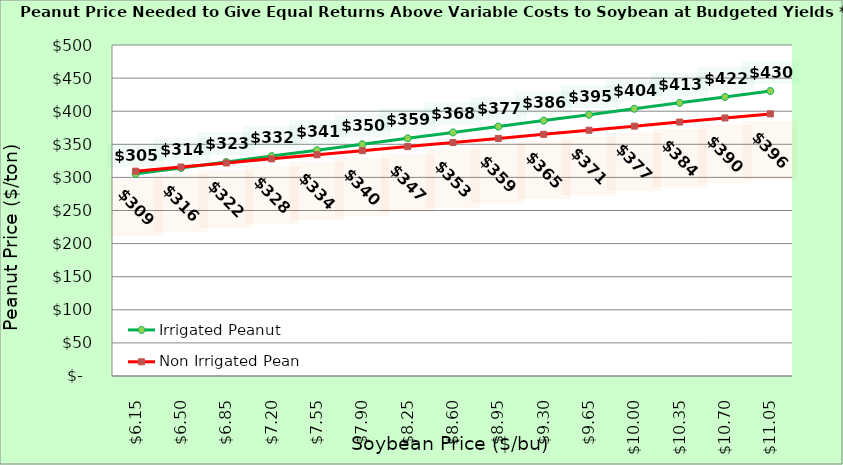
| Category | Irrigated Peanut | Non Irrigated Peanut |
|---|---|---|
| 6.150000000000002 | 305.365 | 309.47 |
| 6.500000000000002 | 314.301 | 315.646 |
| 6.850000000000001 | 323.237 | 321.823 |
| 7.200000000000001 | 332.173 | 327.999 |
| 7.550000000000001 | 341.109 | 334.175 |
| 7.9 | 350.046 | 340.352 |
| 8.25 | 358.982 | 346.528 |
| 8.6 | 367.918 | 352.705 |
| 8.95 | 376.854 | 358.881 |
| 9.299999999999999 | 385.79 | 365.058 |
| 9.649999999999999 | 394.726 | 371.234 |
| 9.999999999999998 | 403.663 | 377.411 |
| 10.349999999999998 | 412.599 | 383.587 |
| 10.699999999999998 | 421.535 | 389.764 |
| 11.049999999999997 | 430.471 | 395.94 |